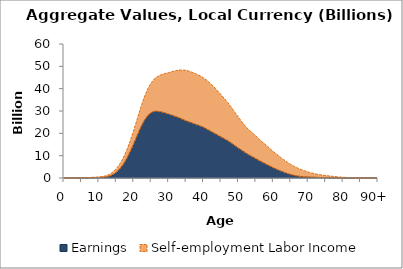
| Category | Earnings | Self-employment Labor Income |
|---|---|---|
| 0 | 0 | 0 |
|  | 0 | 0 |
| 2 | 0 | 1.298 |
| 3 | 0 | 2.669 |
| 4 | 0 | 4.518 |
| 5 | 0 | 19.115 |
| 6 | 25.863 | 69.825 |
| 7 | 85.769 | 111.767 |
| 8 | 135.673 | 159.337 |
| 9 | 171.529 | 205.936 |
| 10 | 210.767 | 269.44 |
| 11 | 295.846 | 362.139 |
| 12 | 472.251 | 512.189 |
| 13 | 840.525 | 756.33 |
| 14 | 1506.083 | 1133.437 |
| 15 | 2575.853 | 1594.435 |
| 16 | 4090.786 | 2176.154 |
| 17 | 6126.952 | 2900.167 |
| 18 | 8727.911 | 3767.182 |
| 19 | 11866.069 | 4820.662 |
| 20 | 15362.503 | 6059.823 |
| 21 | 19059.959 | 7426.396 |
| 22 | 22669.372 | 8933.015 |
| 23 | 25685.483 | 10461.581 |
| 24 | 27909.873 | 11985.634 |
| 25 | 29269.754 | 13371.594 |
| 26 | 29883.191 | 14653.412 |
| 27 | 29818.386 | 15777.365 |
| 28 | 29516.805 | 16843.731 |
| 29 | 29099.067 | 17711.33 |
| 30 | 28608.793 | 18568.215 |
| 31 | 28058.608 | 19605.249 |
| 32 | 27517.266 | 20565.441 |
| 33 | 26965.108 | 21382.95 |
| 34 | 26248.095 | 22074.043 |
| 35 | 25560.367 | 22687.477 |
| 36 | 24984.198 | 22744.917 |
| 37 | 24468.412 | 22730.385 |
| 38 | 23859.254 | 22611.148 |
| 39 | 23312.118 | 22469.102 |
| 40 | 22668.877 | 22099.603 |
| 41 | 21825.25 | 21846.997 |
| 42 | 20943.817 | 21311.435 |
| 43 | 20095.97 | 20619.944 |
| 44 | 19241.7 | 19811.411 |
| 45 | 18370.115 | 18952.167 |
| 46 | 17525.159 | 17978.347 |
| 47 | 16622.295 | 17048.186 |
| 48 | 15578.86 | 16007.982 |
| 49 | 14458.133 | 14878.422 |
| 50 | 13359.069 | 13819.479 |
| 51 | 12340.114 | 12815.14 |
| 52 | 11252.45 | 11912.6 |
| 53 | 10329.015 | 11225.757 |
| 54 | 9471.352 | 10708.702 |
| 55 | 8654.147 | 10152.992 |
| 56 | 7719.012 | 9582.277 |
| 57 | 6913.033 | 9057.146 |
| 58 | 6107.798 | 8483.559 |
| 59 | 5341.443 | 7848.725 |
| 60 | 4552.352 | 7260.761 |
| 61 | 3860.591 | 6712.444 |
| 62 | 3197.074 | 6147.702 |
| 63 | 2590.635 | 5577.996 |
| 64 | 2012.434 | 5051.659 |
| 65 | 1546.708 | 4548.734 |
| 66 | 1155.137 | 4060.699 |
| 67 | 856.009 | 3580.454 |
| 68 | 642.735 | 3114.287 |
| 69 | 515.381 | 2662.484 |
| 70 | 420.801 | 2247.036 |
| 71 | 358.579 | 1870.711 |
| 72 | 308.456 | 1555.287 |
| 73 | 251.163 | 1306.566 |
| 74 | 200.135 | 1112.54 |
| 75 | 163.507 | 942.098 |
| 76 | 128.321 | 788.039 |
| 77 | 99.369 | 644.061 |
| 78 | 80.43 | 510.634 |
| 79 | 62.35 | 384.742 |
| 80 | 40.273 | 279.618 |
| 81 | 24.865 | 200.682 |
| 82 | 13.667 | 141.066 |
| 83 | 8.879 | 98.698 |
| 84 | 7.1 | 73.024 |
| 85 | 8.049 | 54.606 |
| 86 | 8.045 | 38.037 |
| 87 | 6.915 | 25.434 |
| 88 | 4.423 | 16.092 |
| 89 | 2.36 | 8.176 |
| 90+ | 2.894 | 8.836 |